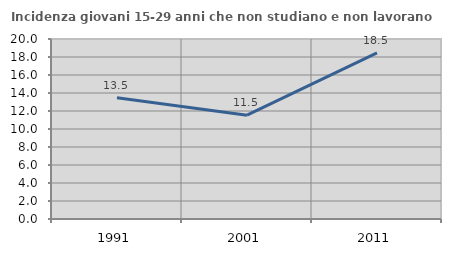
| Category | Incidenza giovani 15-29 anni che non studiano e non lavorano  |
|---|---|
| 1991.0 | 13.466 |
| 2001.0 | 11.534 |
| 2011.0 | 18.462 |